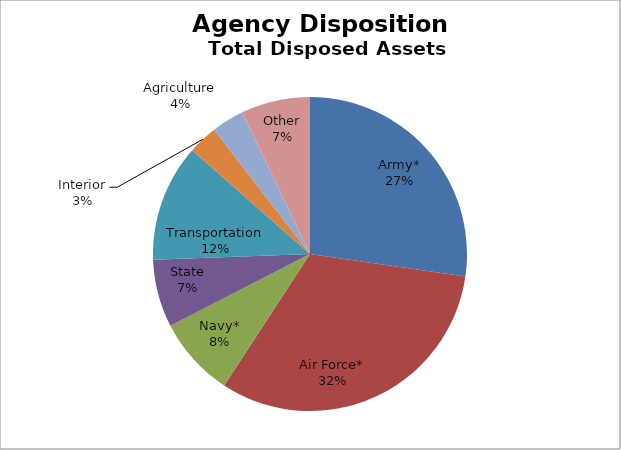
| Category | Series 0 |
|---|---|
| Army* | 6456 |
| Air Force* | 7554 |
| Navy* | 1949 |
| State | 1652 |
| Transportation | 2857 |
| Interior | 722 |
| Agriculture | 793 |
| Other | 1680 |